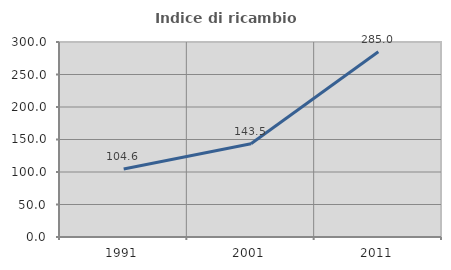
| Category | Indice di ricambio occupazionale  |
|---|---|
| 1991.0 | 104.634 |
| 2001.0 | 143.466 |
| 2011.0 | 285.035 |